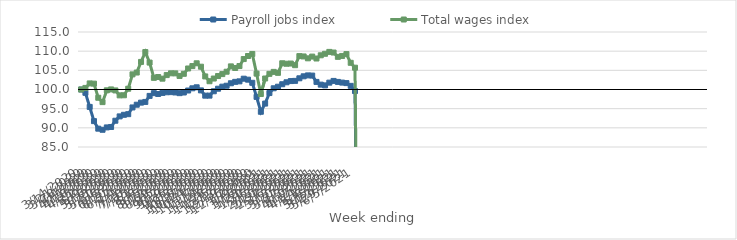
| Category | Payroll jobs index | Total wages index |
|---|---|---|
| 14/03/2020 | 100 | 100 |
| 21/03/2020 | 99.135 | 100.412 |
| 28/03/2020 | 95.457 | 101.587 |
| 04/04/2020 | 91.749 | 101.53 |
| 11/04/2020 | 89.782 | 97.845 |
| 18/04/2020 | 89.495 | 96.707 |
| 25/04/2020 | 90.108 | 99.785 |
| 02/05/2020 | 90.221 | 100.02 |
| 09/05/2020 | 91.854 | 99.757 |
| 16/05/2020 | 92.984 | 98.471 |
| 23/05/2020 | 93.398 | 98.493 |
| 30/05/2020 | 93.568 | 100.201 |
| 06/06/2020 | 95.319 | 103.949 |
| 13/06/2020 | 96.032 | 104.426 |
| 20/06/2020 | 96.574 | 107.197 |
| 27/06/2020 | 96.759 | 109.768 |
| 04/07/2020 | 98.332 | 107.025 |
| 11/07/2020 | 99.05 | 103.044 |
| 18/07/2020 | 98.831 | 103.254 |
| 25/07/2020 | 99.108 | 102.825 |
| 01/08/2020 | 99.282 | 103.756 |
| 08/08/2020 | 99.314 | 104.224 |
| 15/08/2020 | 99.226 | 104.208 |
| 22/08/2020 | 99.048 | 103.535 |
| 29/08/2020 | 99.215 | 104.094 |
| 05/09/2020 | 99.734 | 105.486 |
| 12/09/2020 | 100.313 | 106.114 |
| 19/09/2020 | 100.578 | 106.836 |
| 26/09/2020 | 99.77 | 105.948 |
| 03/10/2020 | 98.391 | 103.409 |
| 10/10/2020 | 98.402 | 102.156 |
| 17/10/2020 | 99.539 | 102.861 |
| 24/10/2020 | 100.206 | 103.512 |
| 31/10/2020 | 100.738 | 104.018 |
| 07/11/2020 | 100.985 | 104.638 |
| 14/11/2020 | 101.627 | 106.032 |
| 21/11/2020 | 101.994 | 105.61 |
| 28/11/2020 | 102.127 | 106.119 |
| 05/12/2020 | 102.82 | 107.941 |
| 12/12/2020 | 102.565 | 108.739 |
| 19/12/2020 | 101.746 | 109.276 |
| 26/12/2020 | 98.073 | 104.142 |
| 02/01/2021 | 94.191 | 98.821 |
| 09/01/2021 | 96.324 | 102.868 |
| 16/01/2021 | 99.075 | 104.085 |
| 23/01/2021 | 100.319 | 104.594 |
| 30/01/2021 | 100.728 | 104.342 |
| 06/02/2021 | 101.373 | 106.843 |
| 13/02/2021 | 101.881 | 106.719 |
| 20/02/2021 | 102.2 | 106.773 |
| 27/02/2021 | 102.253 | 106.346 |
| 06/03/2021 | 102.924 | 108.711 |
| 13/03/2021 | 103.444 | 108.621 |
| 20/03/2021 | 103.677 | 108.132 |
| 27/03/2021 | 103.628 | 108.587 |
| 03/04/2021 | 101.977 | 108.084 |
| 10/04/2021 | 101.268 | 108.924 |
| 17/04/2021 | 101.076 | 109.319 |
| 24/04/2021 | 101.787 | 109.81 |
| 01/05/2021 | 102.241 | 109.642 |
| 08/05/2021 | 101.981 | 108.518 |
| 15/05/2021 | 101.8 | 108.754 |
| 22/05/2021 | 101.666 | 109.24 |
| 29/05/2021 | 100.951 | 106.962 |
| 05/06/2021 | 99.598 | 105.69 |